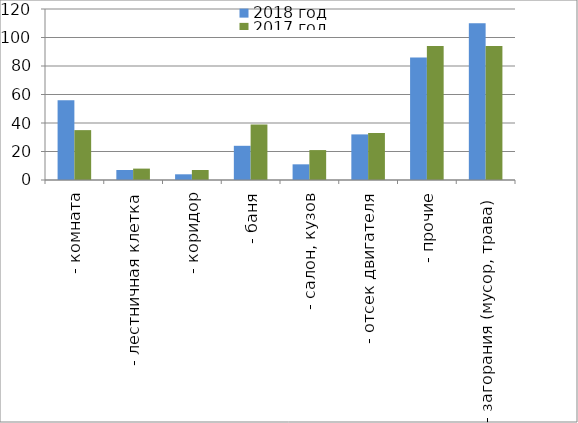
| Category | 2018 год | 2017 год |
|---|---|---|
|  - комната | 56 | 35 |
|  - лестничная клетка | 7 | 8 |
|  - коридор | 4 | 7 |
|  - баня | 24 | 39 |
|  - салон, кузов | 11 | 21 |
|  - отсек двигателя | 32 | 33 |
| - прочие | 86 | 94 |
| - загорания (мусор, трава)  | 110 | 94 |